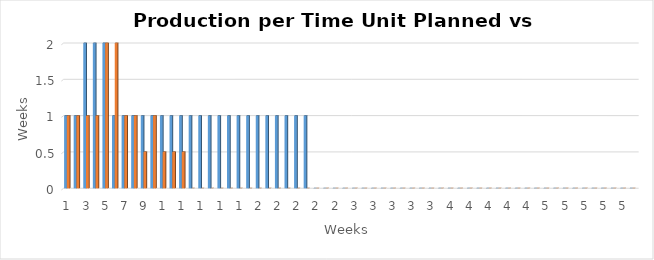
| Category | WP | WA |
|---|---|---|
| 0 | 1 | 1 |
| 1 | 1 | 1 |
| 2 | 2 | 1 |
| 3 | 2 | 1 |
| 4 | 2 | 2 |
| 5 | 1 | 2 |
| 6 | 1 | 1 |
| 7 | 1 | 1 |
| 8 | 1 | 0.5 |
| 9 | 1 | 1 |
| 10 | 1 | 0.5 |
| 11 | 1 | 0.5 |
| 12 | 1 | 0.5 |
| 13 | 1 | 0 |
| 14 | 1 | 0 |
| 15 | 1 | 0 |
| 16 | 1 | 0 |
| 17 | 1 | 0 |
| 18 | 1 | 0 |
| 19 | 1 | 0 |
| 20 | 1 | 0 |
| 21 | 1 | 0 |
| 22 | 1 | 0 |
| 23 | 1 | 0 |
| 24 | 1 | 0 |
| 25 | 1 | 0 |
| 26 | 0 | 0 |
| 27 | 0 | 0 |
| 28 | 0 | 0 |
| 29 | 0 | 0 |
| 30 | 0 | 0 |
| 31 | 0 | 0 |
| 32 | 0 | 0 |
| 33 | 0 | 0 |
| 34 | 0 | 0 |
| 35 | 0 | 0 |
| 36 | 0 | 0 |
| 37 | 0 | 0 |
| 38 | 0 | 0 |
| 39 | 0 | 0 |
| 40 | 0 | 0 |
| 41 | 0 | 0 |
| 42 | 0 | 0 |
| 43 | 0 | 0 |
| 44 | 0 | 0 |
| 45 | 0 | 0 |
| 46 | 0 | 0 |
| 47 | 0 | 0 |
| 48 | 0 | 0 |
| 49 | 0 | 0 |
| 50 | 0 | 0 |
| 51 | 0 | 0 |
| 52 | 0 | 0 |
| 53 | 0 | 0 |
| 54 | 0 | 0 |
| 55 | 0 | 0 |
| 56 | 0 | 0 |
| 57 | 0 | 0 |
| 58 | 0 | 0 |
| 59 | 0 | 0 |